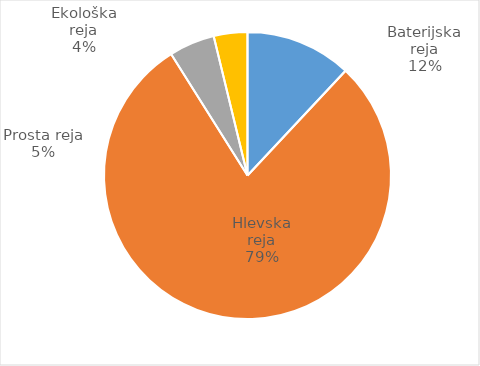
| Category | Količina kosov jajc |
|---|---|
| Baterijska reja | 429671 |
| Hlevska reja | 2838652 |
| Prosta reja | 184580 |
| Ekološka reja | 136154 |